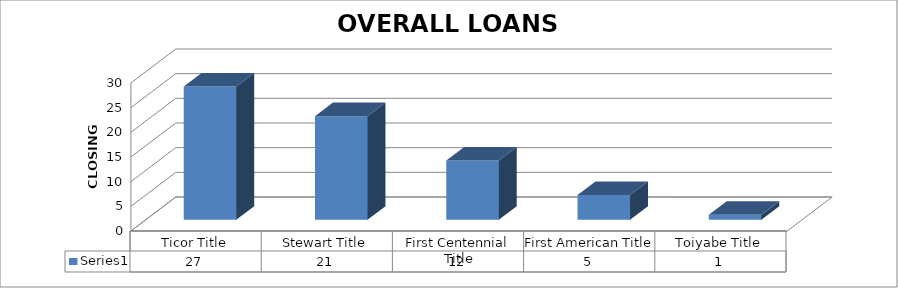
| Category | Series 0 |
|---|---|
| Ticor Title | 27 |
| Stewart Title | 21 |
| First Centennial Title | 12 |
| First American Title | 5 |
| Toiyabe Title | 1 |